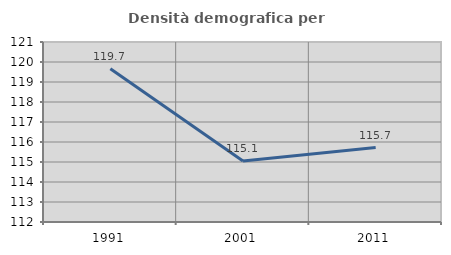
| Category | Densità demografica |
|---|---|
| 1991.0 | 119.665 |
| 2001.0 | 115.05 |
| 2011.0 | 115.721 |